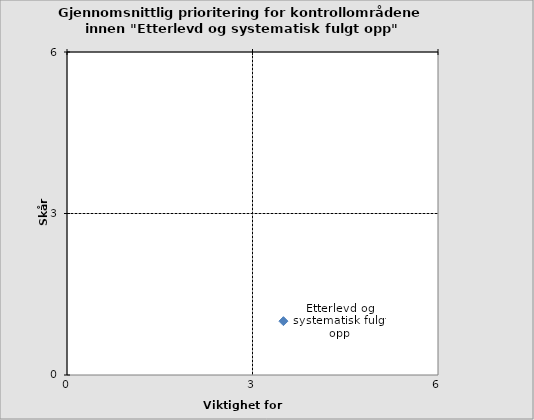
| Category | Etterlevd og systematisk fulgt opp |
|---|---|
| 3.5 | 1 |